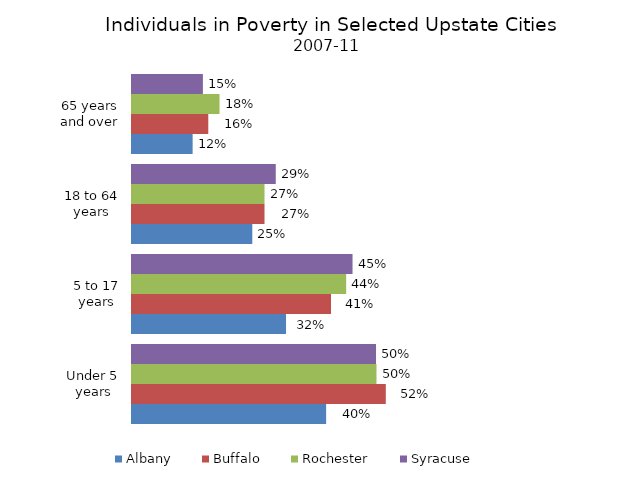
| Category | Albany | Buffalo | Rochester | Syracuse |
|---|---|---|---|---|
| Under 5 years | 0.397 | 0.519 | 0.5 | 0.499 |
| 5 to 17 years | 0.315 | 0.407 | 0.438 | 0.451 |
| 18 to 64 years | 0.246 | 0.271 | 0.271 | 0.294 |
| 65 years and over | 0.124 | 0.156 | 0.179 | 0.145 |